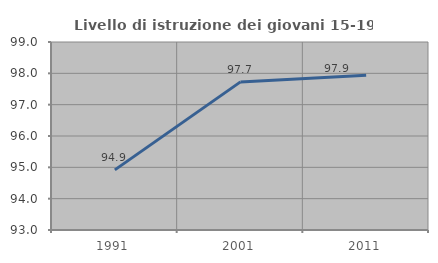
| Category | Livello di istruzione dei giovani 15-19 anni |
|---|---|
| 1991.0 | 94.919 |
| 2001.0 | 97.727 |
| 2011.0 | 97.942 |